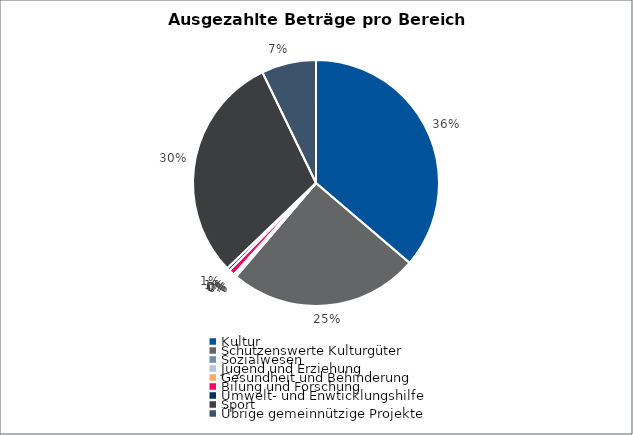
| Category | Series 0 |
|---|---|
| Kultur | 974183 |
| Schützenswerte Kulturgüter | 671917 |
| Sozialwesen | 3000 |
| Jugend und Erziehung | 7300 |
| Gesundheit und Behinderung | 0 |
| Bilung und Forschung | 21000 |
| Umwelt- und Enwticklungshilfe | 11000 |
| Sport | 806300 |
| Übrige gemeinnützige Projekte | 192967 |